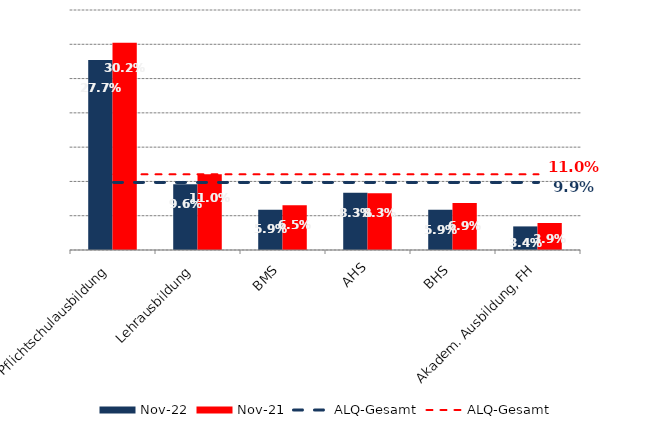
| Category | Nov 22 | Nov 21 |
|---|---|---|
| Pflichtschulausbildung | 0.277 | 0.302 |
| Lehrausbildung | 0.096 | 0.11 |
| BMS | 0.059 | 0.065 |
| AHS | 0.083 | 0.083 |
| BHS | 0.059 | 0.069 |
| Akadem. Ausbildung, FH | 0.034 | 0.039 |